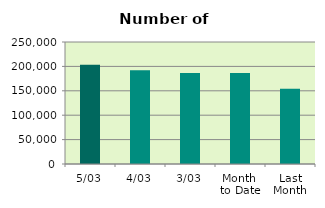
| Category | Series 0 |
|---|---|
| 5/03 | 203274 |
| 4/03 | 192250 |
| 3/03 | 186696 |
| Month 
to Date | 186555.2 |
| Last
Month | 154356.5 |